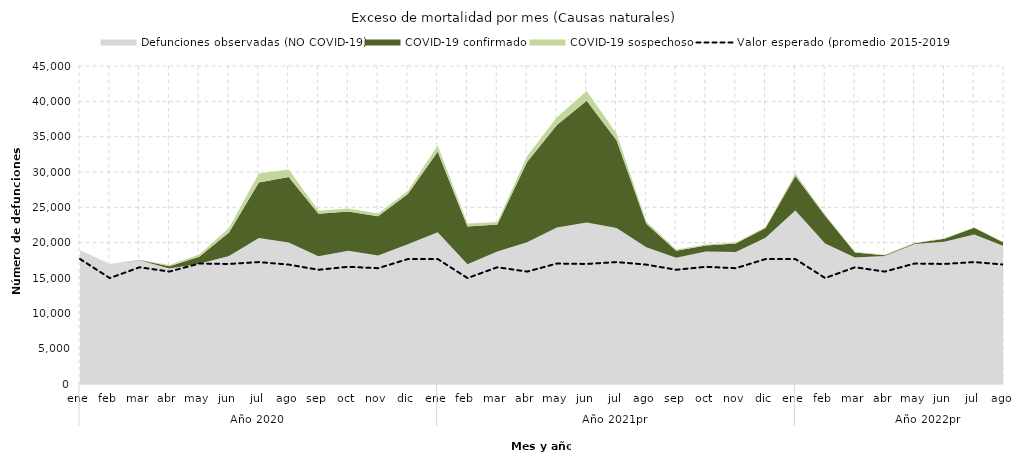
| Category | Valor esperado (promedio 2015-2019) |
|---|---|
| 0 | 17685.8 |
| 1 | 14990.8 |
| 2 | 16519.2 |
| 3 | 15907.8 |
| 4 | 17045.6 |
| 5 | 16988 |
| 6 | 17253.6 |
| 7 | 16895.8 |
| 8 | 16166 |
| 9 | 16585.4 |
| 10 | 16387.6 |
| 11 | 17678.2 |
| 12 | 17685.8 |
| 13 | 14990.8 |
| 14 | 16519.2 |
| 15 | 15907.8 |
| 16 | 17045.6 |
| 17 | 16988 |
| 18 | 17253.6 |
| 19 | 16895.8 |
| 20 | 16166 |
| 21 | 16585.4 |
| 22 | 16387.6 |
| 23 | 17678.2 |
| 24 | 17685.8 |
| 25 | 14990.8 |
| 26 | 16519.2 |
| 27 | 15907.8 |
| 28 | 17045.6 |
| 29 | 16988 |
| 30 | 17253.6 |
| 31 | 16895.8 |